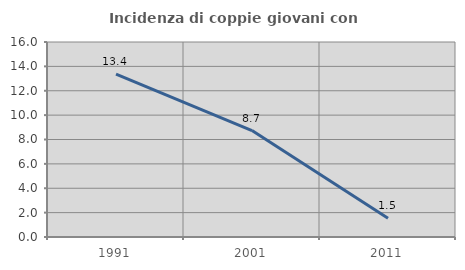
| Category | Incidenza di coppie giovani con figli |
|---|---|
| 1991.0 | 13.36 |
| 2001.0 | 8.734 |
| 2011.0 | 1.546 |